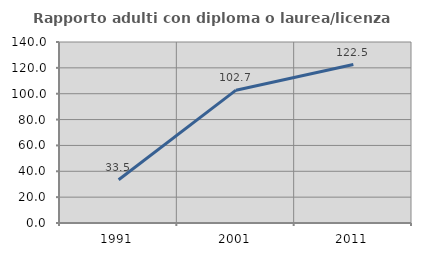
| Category | Rapporto adulti con diploma o laurea/licenza media  |
|---|---|
| 1991.0 | 33.5 |
| 2001.0 | 102.74 |
| 2011.0 | 122.541 |